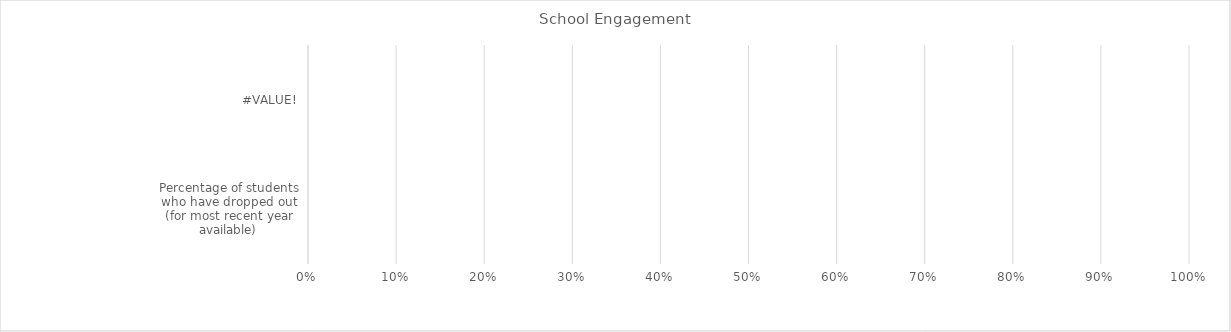
| Category | Benchmark | Entire LEA  | Title IV-A Identified Schools |
|---|---|---|---|
| #VALUE! | 0 | 0 | 0 |
| Percentage of students who have dropped out (for most recent year available) | 0 | 0 | 0 |